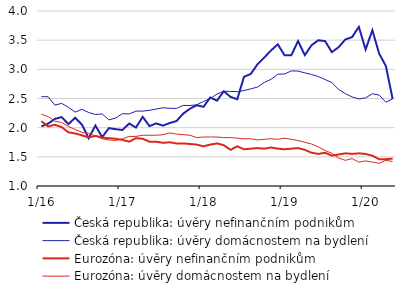
| Category | Česká republika: úvěry nefinančním podnikům | Česká republika: úvěry domácnostem na bydlení | Eurozóna: úvěry nefinančním podnikům | Eurozóna: úvěry domácnostem na bydlení |
|---|---|---|---|---|
|  1/16 | 2.022 | 2.531 | 2.11 | 2.23 |
| 2 | 2.069 | 2.531 | 2.02 | 2.19 |
| 3 | 2.15 | 2.386 | 2.05 | 2.11 |
| 4 | 2.181 | 2.416 | 2.01 | 2.09 |
| 5 | 2.061 | 2.349 | 1.92 | 2.02 |
| 6 | 2.17 | 2.267 | 1.9 | 1.97 |
| 7 | 2.053 | 2.314 | 1.87 | 1.92 |
| 8 | 1.819 | 2.26 | 1.83 | 1.9 |
| 9 | 2.037 | 2.226 | 1.86 | 1.86 |
| 10 | 1.837 | 2.235 | 1.83 | 1.81 |
| 11 | 1.992 | 2.133 | 1.82 | 1.79 |
| 12 | 1.974 | 2.165 | 1.81 | 1.78 |
|  1/17 | 1.96 | 2.241 | 1.79 | 1.81 |
| 2 | 2.071 | 2.235 | 1.76 | 1.85 |
| 3 | 2.002 | 2.284 | 1.82 | 1.85 |
| 4 | 2.186 | 2.284 | 1.81 | 1.87 |
| 5 | 2.027 | 2.297 | 1.76 | 1.87 |
| 6 | 2.073 | 2.32 | 1.76 | 1.87 |
| 7 | 2.035 | 2.341 | 1.74 | 1.88 |
| 8 | 2.08 | 2.332 | 1.75 | 1.91 |
| 9 | 2.113 | 2.33 | 1.73 | 1.89 |
| 10 | 2.241 | 2.382 | 1.73 | 1.88 |
| 11 | 2.325 | 2.38 | 1.72 | 1.87 |
| 12 | 2.384 | 2.392 | 1.71 | 1.83 |
|  1/18 | 2.357 | 2.449 | 1.68 | 1.84 |
| 2 | 2.517 | 2.499 | 1.71 | 1.84 |
| 3 | 2.463 | 2.576 | 1.73 | 1.84 |
| 4 | 2.624 | 2.624 | 1.7 | 1.83 |
| 5 | 2.528 | 2.621 | 1.62 | 1.83 |
| 6 | 2.487 | 2.618 | 1.68 | 1.82 |
| 7 | 2.872 | 2.637 | 1.63 | 1.81 |
| 8 | 2.921 | 2.665 | 1.64 | 1.81 |
| 9 | 3.088 | 2.696 | 1.65 | 1.79 |
| 10 | 3.204 | 2.775 | 1.64 | 1.8 |
| 11 | 3.324 | 2.829 | 1.66 | 1.81 |
| 12 | 3.429 | 2.916 | 1.64 | 1.8 |
|  1/19 | 3.241 | 2.921 | 1.63 | 1.82 |
| 2 | 3.241 | 2.973 | 1.64 | 1.8 |
| 3 | 3.484 | 2.97 | 1.65 | 1.78 |
| 4 | 3.243 | 2.94 | 1.62 | 1.75 |
| 5 | 3.414 | 2.911 | 1.57 | 1.72 |
| 6 | 3.498 | 2.876 | 1.55 | 1.67 |
| 7 | 3.484 | 2.825 | 1.57 | 1.61 |
| 8 | 3.295 | 2.774 | 1.52 | 1.56 |
| 9 | 3.379 | 2.654 | 1.54 | 1.48 |
| 10 | 3.512 | 2.584 | 1.56 | 1.44 |
| 11 | 3.553 | 2.527 | 1.55 | 1.47 |
| 12 | 3.727 | 2.492 | 1.56 | 1.41 |
|  1/20 | 3.34 | 2.51 | 1.55 | 1.43 |
| 2 | 3.671 | 2.581 | 1.52 | 1.41 |
| 3 | 3.272 | 2.559 | 1.46 | 1.39 |
| 4 | 3.057 | 2.437 | 1.46 | 1.44 |
| 5 | 2.493 | 2.493 | 1.47 | 1.42 |